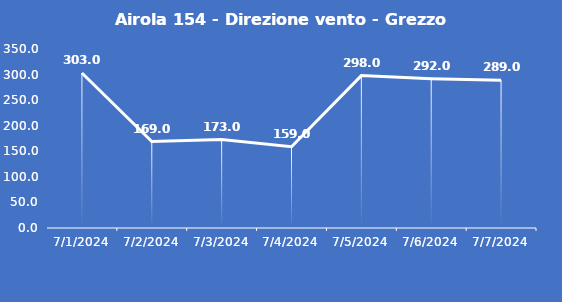
| Category | Airola 154 - Direzione vento - Grezzo (°N) |
|---|---|
| 7/1/24 | 303 |
| 7/2/24 | 169 |
| 7/3/24 | 173 |
| 7/4/24 | 159 |
| 7/5/24 | 298 |
| 7/6/24 | 292 |
| 7/7/24 | 289 |